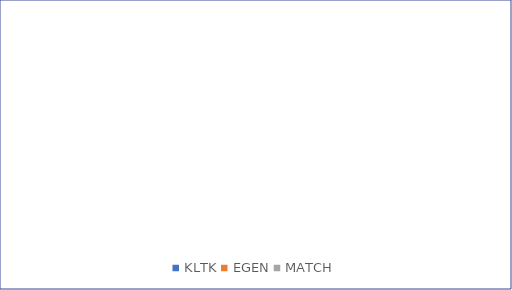
| Category | Series 0 |
|---|---|
| KLTK | 0 |
| EGEN | 0 |
| MATCH | 0 |